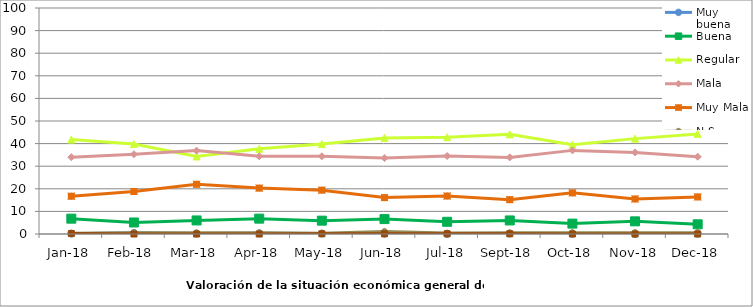
| Category | Muy buena | Buena | Regular | Mala | Muy Mala | N.S. | N.C. |
|---|---|---|---|---|---|---|---|
| 2018-01-01 | 0.161 | 6.782 | 41.784 | 33.993 | 16.714 | 0.363 | 0.202 |
| 2018-02-01 | 0.5 | 5.1 | 39.8 | 35.3 | 18.8 | 0.5 | 0 |
| 2018-03-01 | 0.2 | 6 | 34.3 | 36.9 | 22 | 0.5 | 0 |
| 2018-04-01 | 0.3 | 6.8 | 37.7 | 34.4 | 20.3 | 0.5 | 0 |
| 2018-05-01 | 0.2 | 5.9 | 39.8 | 34.4 | 19.4 | 0.3 | 0.1 |
| 2018-06-01 | 0.1 | 6.6 | 42.5 | 33.6 | 16.1 | 1.1 | 0.1 |
| 2018-07-01 | 0 | 5.4 | 42.8 | 34.5 | 16.8 | 0.4 | 0.1 |
| 2018-09-01 | 0.2 | 6 | 44.1 | 33.9 | 15.2 | 0.5 | 0.1 |
| 2018-10-01 | 0.1 | 4.6 | 39.5 | 37 | 18.2 | 0.6 | 0 |
| 2018-11-01 | 0 | 5.6 | 42.2 | 36.1 | 15.5 | 0.6 | 0 |
| 2018-12-01 | 0.2 | 4.3 | 44.3 | 34.2 | 16.4 | 0.6 | 0 |